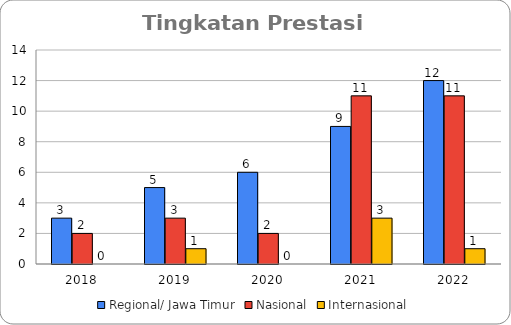
| Category | Regional/ Jawa Timur | Nasional | Internasional |
|---|---|---|---|
| 2018.0 | 3 | 2 | 0 |
| 2019.0 | 5 | 3 | 1 |
| 2020.0 | 6 | 2 | 0 |
| 2021.0 | 9 | 11 | 3 |
| 2022.0 | 12 | 11 | 1 |